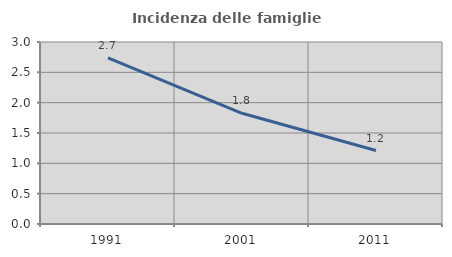
| Category | Incidenza delle famiglie numerose |
|---|---|
| 1991.0 | 2.74 |
| 2001.0 | 1.825 |
| 2011.0 | 1.211 |